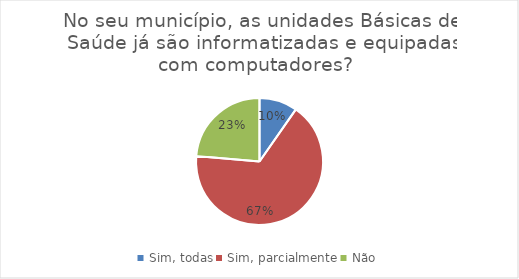
| Category | Series 0 |
|---|---|
| Sim, todas | 16 |
| Sim, parcialmente | 110 |
| Não | 39 |